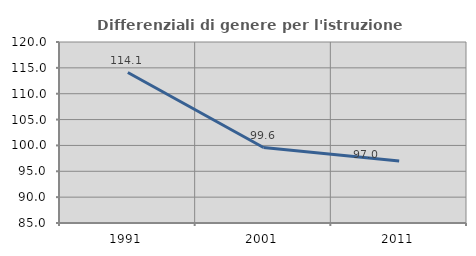
| Category | Differenziali di genere per l'istruzione superiore |
|---|---|
| 1991.0 | 114.099 |
| 2001.0 | 99.589 |
| 2011.0 | 96.969 |